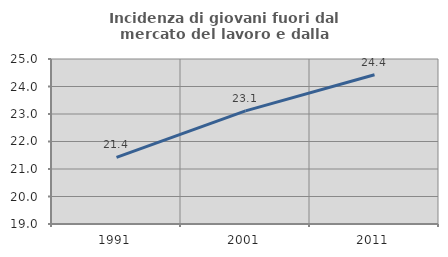
| Category | Incidenza di giovani fuori dal mercato del lavoro e dalla formazione  |
|---|---|
| 1991.0 | 21.422 |
| 2001.0 | 23.112 |
| 2011.0 | 24.427 |